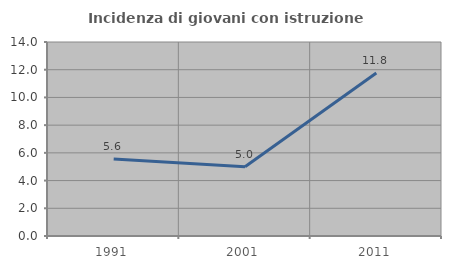
| Category | Incidenza di giovani con istruzione universitaria |
|---|---|
| 1991.0 | 5.556 |
| 2001.0 | 5 |
| 2011.0 | 11.765 |